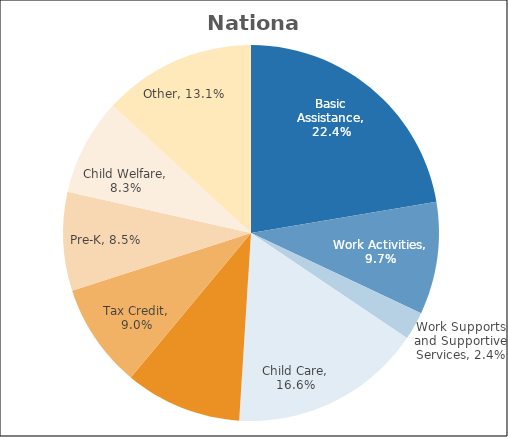
| Category | Series 0 |
|---|---|
| Basic Assistance | 0.224 |
| Work Activities | 0.097 |
| Work Supports and Supportive Services | 0.024 |
| Child Care | 0.166 |
| Program Management | 0.1 |
| Tax Credit | 0.09 |
| Pre-K | 0.085 |
| Child Welfare | 0.083 |
| Other | 0.131 |